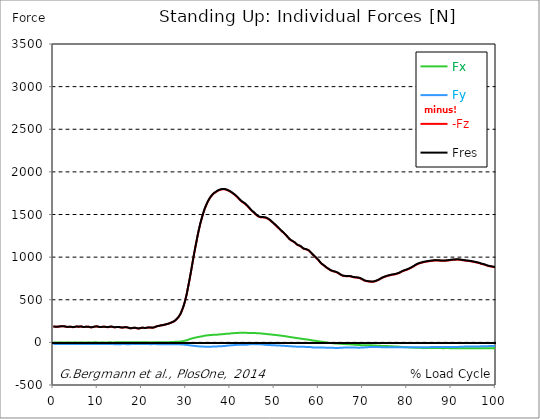
| Category |  Fx |  Fy |  -Fz |  Fres |
|---|---|---|---|---|
| 0.0 | -1.78 | -19.91 | 186.3 | 187.47 |
| 0.167348456675344 | -1.93 | -20.02 | 185.65 | 186.83 |
| 0.334696913350688 | -2.07 | -20.06 | 183.83 | 185.03 |
| 0.5020453700260321 | -1.86 | -19.89 | 182.56 | 183.75 |
| 0.669393826701376 | -1.54 | -19.67 | 182.43 | 183.59 |
| 0.83674228337672 | -1.32 | -19.46 | 183.34 | 184.47 |
| 1.0040907400520642 | -1.37 | -19.3 | 183.87 | 184.97 |
| 1.1621420602454444 | -1.34 | -19.09 | 183.55 | 184.62 |
| 1.3294905169207885 | -1.08 | -18.94 | 184.7 | 185.74 |
| 1.4968389735961325 | -0.89 | -18.94 | 186.75 | 187.76 |
| 1.6641874302714765 | -0.77 | -19.04 | 188.98 | 189.98 |
| 1.8315358869468206 | -0.92 | -19.1 | 189.7 | 190.71 |
| 1.9988843436221646 | -1.12 | -19.18 | 189.45 | 190.48 |
| 2.1662328002975086 | -1.13 | -19.22 | 188.72 | 189.75 |
| 2.333581256972853 | -1.19 | -19.28 | 188.54 | 189.59 |
| 2.5009297136481967 | -1.51 | -19.33 | 187.61 | 188.67 |
| 2.6682781703235405 | -2.02 | -19.36 | 185.43 | 186.52 |
| 2.8356266269988843 | -2.42 | -19.34 | 183.05 | 184.16 |
| 3.002975083674229 | -2.61 | -19.35 | 181.31 | 182.44 |
| 3.1703235403495724 | -2.52 | -19.3 | 180.35 | 181.5 |
| 3.337671997024917 | -2.44 | -19.27 | 180.32 | 181.47 |
| 3.4957233172182973 | -2.44 | -19.34 | 181.67 | 182.82 |
| 3.663071773893641 | -2.46 | -19.44 | 182.89 | 184.04 |
| 3.8304202305689854 | -2.65 | -19.51 | 182.95 | 184.1 |
| 3.997768687244329 | -2.84 | -19.51 | 181.86 | 183.02 |
| 4.165117143919673 | -3.04 | -19.49 | 180.1 | 181.26 |
| 4.332465600595017 | -2.98 | -19.36 | 178.59 | 179.75 |
| 4.499814057270361 | -2.7 | -19.14 | 178 | 179.13 |
| 4.667162513945706 | -2.14 | -18.91 | 179.07 | 180.14 |
| 4.834510970621049 | -1.52 | -18.8 | 181.09 | 182.12 |
| 5.001859427296393 | -1.25 | -18.95 | 183.31 | 184.34 |
| 5.169207883971737 | -1.15 | -19.07 | 184.97 | 186 |
| 5.336556340647081 | -1.26 | -19.14 | 185.38 | 186.42 |
| 5.503904797322425 | -1.35 | -19.21 | 184.56 | 185.62 |
| 5.671253253997769 | -1.37 | -19.28 | 183.21 | 184.29 |
| 5.82930457419115 | -1.03 | -19.22 | 183.03 | 184.1 |
| 5.996653030866494 | -0.63 | -19.12 | 184.75 | 185.8 |
| 6.164001487541838 | -0.43 | -19.07 | 186.35 | 187.39 |
| 6.331349944217181 | -0.72 | -19.1 | 185.88 | 186.92 |
| 6.498698400892526 | -1.12 | -19.15 | 183.53 | 184.6 |
| 6.66604685756787 | -1.23 | -19.1 | 180.68 | 181.77 |
| 6.833395314243213 | -0.96 | -18.96 | 179.42 | 180.51 |
| 7.000743770918558 | -0.55 | -18.8 | 179.7 | 180.76 |
| 7.168092227593902 | -0.16 | -18.79 | 181.77 | 182.81 |
| 7.335440684269246 | -0.13 | -18.91 | 183.58 | 184.63 |
| 7.50278914094459 | -0.2 | -18.95 | 184.39 | 185.44 |
| 7.6701375976199335 | -0.62 | -19.06 | 183.55 | 184.63 |
| 7.837486054295278 | -0.86 | -19.16 | 182.59 | 183.7 |
| 7.995537374488658 | -1.09 | -19.27 | 182.08 | 183.22 |
| 8.162885831164003 | -1.15 | -19.33 | 179.45 | 180.6 |
| 8.330234287839346 | -1.12 | -19.35 | 177.57 | 178.74 |
| 8.49758274451469 | -0.85 | -19.34 | 176.88 | 178.04 |
| 8.664931201190035 | -0.5 | -19.31 | 177.03 | 178.17 |
| 8.832279657865378 | -0.25 | -19.35 | 178.46 | 179.58 |
| 8.999628114540721 | 0 | -19.33 | 179.88 | 180.97 |
| 9.166976571216066 | 0.35 | -19.32 | 182.03 | 183.1 |
| 9.334325027891412 | 0.6 | -19.3 | 184.46 | 185.52 |
| 9.501673484566755 | 0.58 | -19.35 | 185.77 | 186.82 |
| 9.669021941242098 | 0.51 | -19.3 | 186.83 | 187.87 |
| 9.836370397917442 | 0.23 | -19.39 | 186.99 | 188.05 |
| 10.003718854592787 | -0.33 | -19.59 | 185.93 | 187.03 |
| 10.17106731126813 | -0.99 | -19.78 | 183.37 | 184.52 |
| 10.329118631461512 | -1.35 | -19.8 | 180.67 | 181.85 |
| 10.496467088136853 | -1.35 | -19.74 | 179.36 | 180.56 |
| 10.663815544812199 | -1.24 | -19.69 | 178.87 | 180.07 |
| 10.831164001487544 | -1.07 | -19.59 | 179.61 | 180.8 |
| 10.998512458162887 | -0.91 | -19.59 | 181.05 | 182.23 |
| 11.16586091483823 | -0.8 | -19.65 | 182.78 | 183.96 |
| 11.333209371513574 | -0.9 | -19.66 | 183.15 | 184.34 |
| 11.50055782818892 | -0.98 | -19.58 | 182.6 | 183.78 |
| 11.667906284864264 | -1.06 | -19.59 | 182.46 | 183.63 |
| 11.835254741539607 | -1.2 | -19.61 | 181.07 | 182.25 |
| 12.00260319821495 | -1.19 | -19.71 | 179.07 | 180.28 |
| 12.169951654890292 | -1 | -19.71 | 177.97 | 179.18 |
| 12.337300111565641 | -0.55 | -19.66 | 177.91 | 179.1 |
| 12.504648568240984 | -0.22 | -19.57 | 179.14 | 180.31 |
| 12.662699888434362 | 0.15 | -19.58 | 181.34 | 182.48 |
| 12.830048345109708 | 0.3 | -19.75 | 183.68 | 184.82 |
| 12.997396801785053 | 0.26 | -19.92 | 184.95 | 186.1 |
| 13.164745258460396 | 0.1 | -20.03 | 184.08 | 185.25 |
| 13.33209371513574 | -0.21 | -20.28 | 182.26 | 183.49 |
| 13.499442171811083 | -0.43 | -20.52 | 179.84 | 181.13 |
| 13.666790628486426 | -0.36 | -20.61 | 177.78 | 179.1 |
| 13.834139085161771 | -0.13 | -20.6 | 176.74 | 178.07 |
| 14.001487541837117 | 0.12 | -20.57 | 176.7 | 178.03 |
| 14.16883599851246 | 0.31 | -20.57 | 177.75 | 179.07 |
| 14.336184455187803 | 0.4 | -20.64 | 179.27 | 180.59 |
| 14.503532911863147 | 0.29 | -20.67 | 179.77 | 181.1 |
| 14.670881368538492 | 0.14 | -20.68 | 179.16 | 180.5 |
| 14.828932688731873 | 0.05 | -20.79 | 178.86 | 180.22 |
| 14.996281145407215 | -0.02 | -20.72 | 177.76 | 179.11 |
| 15.163629602082558 | -0.07 | -20.71 | 175.81 | 177.16 |
| 15.330978058757903 | 0.2 | -20.66 | 173.78 | 175.14 |
| 15.498326515433247 | 0.46 | -20.48 | 172.76 | 174.08 |
| 15.665674972108594 | 0.89 | -20.34 | 173.05 | 174.34 |
| 15.833023428783937 | 1.27 | -20.17 | 174.33 | 175.57 |
| 16.00037188545928 | 1.72 | -20.18 | 176.2 | 177.42 |
| 16.167720342134626 | 1.68 | -20.42 | 177.72 | 178.95 |
| 16.335068798809967 | 1.43 | -20.64 | 177.88 | 179.14 |
| 16.502417255485312 | 1.07 | -20.88 | 176.66 | 177.95 |
| 16.669765712160658 | 0.92 | -21.06 | 175.91 | 177.22 |
| 16.837114168836 | 0.58 | -21.12 | 173.44 | 174.79 |
| 17.004462625511344 | 0.23 | -21.1 | 170.28 | 171.66 |
| 17.16251394570472 | 0.15 | -20.95 | 167.28 | 168.68 |
| 17.32986240238007 | 0.36 | -20.71 | 165.29 | 166.67 |
| 17.497210859055414 | 0.89 | -20.33 | 164.33 | 165.67 |
| 17.664559315730756 | 1.45 | -19.97 | 165.22 | 166.5 |
| 17.8319077724061 | 2.04 | -19.68 | 167.18 | 168.41 |
| 17.999256229081443 | 2.57 | -19.52 | 169.25 | 170.45 |
| 18.166604685756788 | 2.59 | -19.58 | 170.68 | 171.87 |
| 18.333953142432133 | 2.44 | -19.63 | 171.06 | 172.26 |
| 18.501301599107478 | 2.15 | -19.69 | 170.53 | 171.73 |
| 18.668650055782823 | 1.7 | -19.76 | 168.72 | 169.95 |
| 18.835998512458165 | 1.35 | -19.72 | 166.29 | 167.53 |
| 19.00334696913351 | 1.08 | -19.6 | 163.81 | 165.05 |
| 19.170695425808855 | 1.19 | -19.41 | 162.45 | 163.68 |
| 19.338043882484197 | 1.58 | -19.14 | 162.53 | 163.72 |
| 19.496095202677576 | 1.96 | -18.97 | 164.39 | 165.56 |
| 19.66344365935292 | 2.31 | -18.88 | 166.82 | 167.96 |
| 19.830792116028263 | 2.38 | -19.07 | 169.58 | 170.73 |
| 19.998140572703612 | 2.24 | -19.2 | 171.02 | 172.18 |
| 20.165489029378953 | 1.86 | -19.37 | 171.62 | 172.79 |
| 20.3328374860543 | 1.43 | -19.52 | 170.67 | 171.87 |
| 20.500185942729644 | 1.12 | -19.53 | 169.16 | 170.36 |
| 20.667534399404985 | 0.81 | -19.54 | 167.64 | 168.86 |
| 20.83488285608033 | 0.89 | -19.53 | 168.12 | 169.33 |
| 21.002231312755672 | 0.97 | -19.63 | 169.76 | 170.97 |
| 21.16957976943102 | 1 | -19.86 | 171.81 | 173.03 |
| 21.336928226106362 | 0.91 | -20.14 | 173.65 | 174.89 |
| 21.504276682781704 | 0.65 | -20.38 | 174.49 | 175.76 |
| 21.67162513945705 | 0.27 | -20.51 | 174.22 | 175.52 |
| 21.82967645965043 | 0.03 | -20.63 | 173.97 | 175.28 |
| 21.997024916325774 | -0.19 | -20.73 | 173.43 | 174.75 |
| 22.16437337300112 | -0.37 | -20.71 | 172.08 | 173.42 |
| 22.33172182967646 | -0.43 | -20.65 | 171.24 | 172.57 |
| 22.499070286351806 | -0.03 | -20.44 | 172.15 | 173.44 |
| 22.666418743027148 | 0.38 | -20.28 | 173.49 | 174.75 |
| 22.833767199702496 | 0.73 | -20.21 | 175.6 | 176.84 |
| 23.00111565637784 | 1.05 | -20.23 | 179.05 | 180.26 |
| 23.168464113053183 | 1.24 | -20.44 | 183.57 | 184.78 |
| 23.335812569728528 | 1.14 | -20.64 | 187.34 | 188.56 |
| 23.50316102640387 | 1.09 | -20.74 | 190 | 191.21 |
| 23.670509483079215 | 0.85 | -20.8 | 191.27 | 192.49 |
| 23.83785793975456 | 0.52 | -20.86 | 192.06 | 193.3 |
| 23.995909259947936 | 0.56 | -20.94 | 194.32 | 195.55 |
| 24.163257716623285 | 0.55 | -21.14 | 197.41 | 198.66 |
| 24.330606173298627 | 0.71 | -21.11 | 199.06 | 200.3 |
| 24.49795462997397 | 0.9 | -21.04 | 199.79 | 201.02 |
| 24.665303086649313 | 1.09 | -20.97 | 200.54 | 201.76 |
| 24.83265154332466 | 1.31 | -21.02 | 202.75 | 203.98 |
| 25.0 | 1.59 | -21.01 | 205.26 | 206.47 |
| 25.167348456675345 | 1.8 | -20.95 | 207.34 | 208.54 |
| 25.334696913350694 | 1.93 | -20.91 | 208.83 | 210.02 |
| 25.502045370026035 | 1.91 | -21.04 | 212.11 | 213.3 |
| 25.669393826701377 | 1.92 | -20.94 | 213.72 | 214.89 |
| 25.836742283376722 | 2.02 | -20.87 | 215.91 | 217.07 |
| 26.004090740052067 | 2.21 | -20.85 | 218.62 | 219.78 |
| 26.17143919672741 | 2.39 | -20.84 | 221.35 | 222.51 |
| 26.329490516920792 | 2.72 | -20.83 | 224.39 | 225.55 |
| 26.49683897359613 | 3.15 | -20.8 | 227.95 | 229.12 |
| 26.66418743027148 | 3.63 | -20.79 | 232.26 | 233.43 |
| 26.831535886946828 | 4.13 | -20.77 | 235.98 | 237.15 |
| 26.998884343622166 | 4.61 | -20.76 | 239.65 | 240.83 |
| 27.166232800297514 | 5.1 | -20.83 | 243.88 | 245.07 |
| 27.333581256972852 | 5.58 | -20.95 | 248.38 | 249.58 |
| 27.5009297136482 | 6.06 | -21.08 | 253.07 | 254.28 |
| 27.668278170323543 | 6.42 | -21.3 | 261.96 | 263.18 |
| 27.835626626998888 | 6.47 | -21.53 | 270.77 | 272 |
| 28.002975083674233 | 6.84 | -21.71 | 279.66 | 280.9 |
| 28.170323540349575 | 7.39 | -21.9 | 289.8 | 291.03 |
| 28.33767199702492 | 7.94 | -22.24 | 299.15 | 300.4 |
| 28.50502045370026 | 8.7 | -22.76 | 312.3 | 313.58 |
| 28.663071773893645 | 9.83 | -23.01 | 327.17 | 328.48 |
| 28.830420230568986 | 10.75 | -23.68 | 344.26 | 345.61 |
| 28.99776868724433 | 11.89 | -24.36 | 364.32 | 365.7 |
| 29.165117143919673 | 13.22 | -24.98 | 386.79 | 388.22 |
| 29.33246560059502 | 15.14 | -25.31 | 409.87 | 411.36 |
| 29.499814057270367 | 16.73 | -26.28 | 435.21 | 436.77 |
| 29.66716251394571 | 18.68 | -27.1 | 464.3 | 465.94 |
| 29.834510970621054 | 20.92 | -27.87 | 496.35 | 498.06 |
| 30.00185942729639 | 23.19 | -28.86 | 532.08 | 533.86 |
| 30.169207883971744 | 25.77 | -29.67 | 569.34 | 571.21 |
| 30.33655634064708 | 28.59 | -31.12 | 613.86 | 615.84 |
| 30.50390479732243 | 32.03 | -32.04 | 658.17 | 660.31 |
| 30.671253253997772 | 34.93 | -33.18 | 702.44 | 704.74 |
| 30.829304574191156 | 37.96 | -34.48 | 747.36 | 749.81 |
| 30.996653030866494 | 40.38 | -36.12 | 794.88 | 797.46 |
| 31.164001487541842 | 43.66 | -37.04 | 843.19 | 845.91 |
| 31.331349944217187 | 46.37 | -38.16 | 892.77 | 895.59 |
| 31.498698400892525 | 48.72 | -39.3 | 943.93 | 946.82 |
| 31.666046857567874 | 50.75 | -40.22 | 993.01 | 995.94 |
| 31.833395314243212 | 52.68 | -41.07 | 1041.27 | 1044.24 |
| 32.00074377091856 | 54.22 | -42.06 | 1087.52 | 1090.53 |
| 32.1680922275939 | 56.35 | -43.11 | 1133.42 | 1136.49 |
| 32.33544068426925 | 58.62 | -43.93 | 1174.51 | 1177.66 |
| 32.50278914094459 | 60.38 | -44.74 | 1219.73 | 1222.91 |
| 32.670137597619934 | 62.01 | -45.65 | 1263.78 | 1266.98 |
| 32.83748605429528 | 63.52 | -46.48 | 1303.95 | 1307.2 |
| 33.004834510970625 | 65.34 | -47.03 | 1341.92 | 1345.22 |
| 33.162885831164004 | 67.2 | -47.58 | 1379.39 | 1382.73 |
| 33.33023428783935 | 68.61 | -47.78 | 1413.44 | 1416.78 |
| 33.497582744514695 | 69.96 | -47.94 | 1444.09 | 1447.45 |
| 33.664931201190036 | 71.74 | -47.92 | 1474.99 | 1478.39 |
| 33.83227965786538 | 73.65 | -48.23 | 1504.62 | 1508.09 |
| 33.99962811454073 | 75.68 | -49.1 | 1532.34 | 1535.91 |
| 34.16697657121607 | 77.66 | -50.2 | 1558.13 | 1561.81 |
| 34.33432502789141 | 79.21 | -50.79 | 1580.5 | 1584.25 |
| 34.50167348456676 | 80.43 | -51.33 | 1601.59 | 1605.39 |
| 34.6690219412421 | 81.37 | -51.59 | 1621.35 | 1625.17 |
| 34.83637039791744 | 82.32 | -51.67 | 1639.65 | 1643.49 |
| 35.00371885459279 | 83.45 | -51.71 | 1656.83 | 1660.69 |
| 35.17106731126814 | 84.25 | -51.53 | 1672.48 | 1676.35 |
| 35.338415767943474 | 85.04 | -51.26 | 1687.02 | 1690.9 |
| 35.49646708813686 | 85.72 | -50.84 | 1700.28 | 1704.17 |
| 35.6638155448122 | 86.36 | -50.37 | 1712.52 | 1716.4 |
| 35.831164001487544 | 87.01 | -49.87 | 1723.33 | 1727.21 |
| 35.998512458162885 | 87.9 | -49.56 | 1732.82 | 1736.72 |
| 36.165860914838234 | 88.93 | -49.26 | 1741.46 | 1745.39 |
| 36.333209371513576 | 89.82 | -48.82 | 1749.2 | 1753.14 |
| 36.50055782818892 | 90.62 | -48.35 | 1755.64 | 1759.61 |
| 36.667906284864266 | 90.34 | -47.72 | 1760.03 | 1763.95 |
| 36.83525474153961 | 90.08 | -47.41 | 1765.37 | 1769.24 |
| 37.002603198214956 | 90.32 | -47.3 | 1772.21 | 1776.06 |
| 37.1699516548903 | 91 | -46.86 | 1777.7 | 1781.56 |
| 37.337300111565646 | 91.81 | -46.45 | 1782.14 | 1786.02 |
| 37.50464856824098 | 92.74 | -46.01 | 1785.66 | 1789.55 |
| 37.66269988843437 | 94.01 | -45.81 | 1788.97 | 1792.91 |
| 37.83004834510971 | 94.94 | -45.4 | 1791.45 | 1795.41 |
| 37.99739680178505 | 95.25 | -44.69 | 1793.38 | 1797.33 |
| 38.16474525846039 | 95.46 | -44.12 | 1794.8 | 1798.73 |
| 38.33209371513574 | 96.1 | -43.77 | 1795.67 | 1799.6 |
| 38.49944217181109 | 97.72 | -43.28 | 1796.01 | 1799.99 |
| 38.666790628486424 | 98.83 | -42.72 | 1795.29 | 1799.31 |
| 38.83413908516178 | 99.76 | -41.82 | 1793.78 | 1797.82 |
| 39.001487541837115 | 100.46 | -40.79 | 1791.56 | 1795.61 |
| 39.16883599851246 | 100.84 | -39.64 | 1788.64 | 1792.68 |
| 39.336184455187805 | 101.15 | -38.65 | 1785.54 | 1789.58 |
| 39.503532911863154 | 101.39 | -37.09 | 1781.64 | 1785.66 |
| 39.670881368538495 | 102.34 | -36.2 | 1777.27 | 1781.31 |
| 39.83822982521384 | 103.49 | -35.89 | 1772.88 | 1776.97 |
| 39.996281145407224 | 104.47 | -35.21 | 1767.98 | 1772.11 |
| 40.163629602082565 | 105.47 | -34.22 | 1762.14 | 1766.31 |
| 40.33097805875791 | 106.34 | -33.54 | 1756.31 | 1760.52 |
| 40.498326515433256 | 107.16 | -32.94 | 1750.53 | 1754.77 |
| 40.6656749721086 | 107.71 | -32.46 | 1744.17 | 1748.43 |
| 40.83302342878393 | 108.15 | -32.03 | 1737.56 | 1741.85 |
| 41.00037188545929 | 108.59 | -31.53 | 1730.83 | 1735.14 |
| 41.16772034213463 | 109.06 | -30.7 | 1723.39 | 1727.73 |
| 41.33506879880997 | 109.54 | -29.89 | 1715.42 | 1719.8 |
| 41.50241725548531 | 109.97 | -29.37 | 1707.28 | 1711.71 |
| 41.66976571216066 | 110.48 | -28.87 | 1699.1 | 1703.57 |
| 41.837114168836 | 110.99 | -28.25 | 1690.61 | 1695.12 |
| 42.004462625511344 | 112.03 | -27.49 | 1680.7 | 1685.27 |
| 42.17181108218669 | 112.61 | -27.07 | 1671.55 | 1676.17 |
| 42.32986240238007 | 113.01 | -26.99 | 1662.61 | 1667.27 |
| 42.497210859055414 | 113.35 | -26.91 | 1654.27 | 1658.95 |
| 42.66455931573076 | 113.83 | -27.1 | 1648.42 | 1653.14 |
| 42.831907772406105 | 114.38 | -27.39 | 1642.19 | 1646.96 |
| 42.999256229081446 | 114.21 | -27.62 | 1636.97 | 1641.73 |
| 43.16660468575679 | 113.19 | -27.66 | 1631.64 | 1636.31 |
| 43.33395314243214 | 112.34 | -27.75 | 1625.74 | 1630.35 |
| 43.50130159910748 | 112.21 | -28.02 | 1617.39 | 1622.01 |
| 43.66865005578282 | 111.66 | -27.67 | 1608.89 | 1613.48 |
| 43.83599851245817 | 111.18 | -26.75 | 1600.33 | 1604.89 |
| 44.00334696913351 | 110.89 | -25.58 | 1591.92 | 1596.45 |
| 44.17069542580886 | 110.98 | -24.24 | 1582.46 | 1586.99 |
| 44.3380438824842 | 111.28 | -22.89 | 1572.67 | 1577.21 |
| 44.49609520267758 | 111.33 | -21.8 | 1562.83 | 1567.37 |
| 44.66344365935292 | 110.98 | -21.11 | 1552.91 | 1557.44 |
| 44.83079211602827 | 110.91 | -20.59 | 1544.22 | 1548.76 |
| 44.99814057270361 | 110.9 | -20.24 | 1536.02 | 1540.58 |
| 45.16548902937895 | 110.47 | -20.72 | 1529.53 | 1534.08 |
| 45.332837486054295 | 109.8 | -21.27 | 1523.4 | 1527.92 |
| 45.500185942729644 | 109.14 | -21.62 | 1514.23 | 1518.73 |
| 45.66753439940499 | 108.79 | -21.03 | 1505.74 | 1510.22 |
| 45.83488285608033 | 108.42 | -20.76 | 1497.67 | 1502.15 |
| 46.00223131275568 | 108 | -20.69 | 1489.85 | 1494.32 |
| 46.16957976943102 | 107.47 | -21.07 | 1482.6 | 1487.06 |
| 46.336928226106366 | 106.9 | -21.56 | 1476.78 | 1481.22 |
| 46.50427668278171 | 106.26 | -22 | 1472.85 | 1477.26 |
| 46.671625139457056 | 105.63 | -22.37 | 1469.26 | 1473.65 |
| 46.829676459650436 | 105 | -22.8 | 1466.18 | 1470.53 |
| 46.99702491632577 | 104.37 | -23.64 | 1466.14 | 1470.46 |
| 47.16437337300112 | 103.66 | -24.45 | 1466.32 | 1470.61 |
| 47.33172182967646 | 102.87 | -25.24 | 1466.74 | 1470.98 |
| 47.49907028635181 | 101.95 | -25.98 | 1465.72 | 1469.92 |
| 47.66641874302716 | 100.94 | -26.75 | 1464.6 | 1468.76 |
| 47.83376719970249 | 99.93 | -27.59 | 1464.27 | 1468.38 |
| 48.001115656377834 | 98.9 | -28.3 | 1461.82 | 1465.89 |
| 48.16846411305319 | 97.86 | -28.94 | 1458.2 | 1462.23 |
| 48.33581256972853 | 96.82 | -29.58 | 1454.58 | 1458.57 |
| 48.50316102640387 | 95.93 | -30.02 | 1449.66 | 1453.63 |
| 48.67050948307921 | 95.09 | -30.42 | 1444.43 | 1448.38 |
| 48.837857939754564 | 94.32 | -31 | 1438.69 | 1442.63 |
| 49.005206396429905 | 93.6 | -31.69 | 1432.7 | 1436.63 |
| 49.163257716623285 | 92.59 | -32.37 | 1425.12 | 1429.05 |
| 49.33060617329863 | 91.57 | -32.58 | 1416.4 | 1420.28 |
| 49.49795462997397 | 90.7 | -32.77 | 1408.85 | 1412.69 |
| 49.66530308664932 | 89.77 | -33.25 | 1401.59 | 1405.41 |
| 49.832651543324666 | 88.69 | -34 | 1394.25 | 1398.04 |
| 50.0 | 87.87 | -34.44 | 1386.02 | 1389.78 |
| 50.16734845667534 | 87.02 | -34.92 | 1377.94 | 1381.68 |
| 50.33469691335069 | 86.09 | -35.46 | 1369.98 | 1373.71 |
| 50.50204537002604 | 85.02 | -35.92 | 1361.24 | 1364.92 |
| 50.66939382670139 | 84.02 | -36.26 | 1352.56 | 1356.19 |
| 50.836742283376715 | 82.96 | -36.85 | 1344.28 | 1347.89 |
| 51.00409074005207 | 82.07 | -37.03 | 1336.11 | 1339.7 |
| 51.17143919672741 | 81.08 | -37.44 | 1328.86 | 1332.42 |
| 51.32949051692079 | 79.98 | -37.9 | 1319.67 | 1323.19 |
| 51.496838973596134 | 78.69 | -38.49 | 1310.89 | 1314.35 |
| 51.66418743027148 | 77.47 | -38.96 | 1302.67 | 1306.08 |
| 51.831535886946824 | 76.21 | -39.58 | 1294.97 | 1298.34 |
| 51.99888434362217 | 75.43 | -39.8 | 1287.31 | 1290.66 |
| 52.16623280029752 | 74.32 | -40.45 | 1279.05 | 1282.36 |
| 52.33358125697285 | 72.96 | -41.3 | 1270.52 | 1273.8 |
| 52.5009297136482 | 71.72 | -41.45 | 1262.26 | 1265.49 |
| 52.668278170323546 | 70.23 | -41.86 | 1252.24 | 1255.41 |
| 52.835626626998895 | 68.72 | -42.64 | 1242.83 | 1245.96 |
| 53.00297508367424 | 67.18 | -43.33 | 1233.68 | 1236.75 |
| 53.17032354034958 | 65.66 | -43.92 | 1224.22 | 1227.23 |
| 53.33767199702492 | 63.94 | -44.67 | 1213.87 | 1216.8 |
| 53.50502045370027 | 62.63 | -45.32 | 1206.12 | 1209.02 |
| 53.663071773893655 | 61.38 | -45.96 | 1199.01 | 1201.89 |
| 53.83042023056899 | 60.07 | -46.6 | 1194.46 | 1197.32 |
| 53.99776868724433 | 58.89 | -47.15 | 1189.28 | 1192.13 |
| 54.16511714391967 | 57.67 | -47.93 | 1183.47 | 1186.34 |
| 54.33246560059503 | 56.37 | -48.24 | 1178.76 | 1181.6 |
| 54.49981405727037 | 55.08 | -48.36 | 1173.71 | 1176.51 |
| 54.667162513945705 | 53.8 | -48.54 | 1167.93 | 1170.7 |
| 54.834510970621054 | 52.38 | -49 | 1159.28 | 1162 |
| 55.0018594272964 | 50.81 | -50.26 | 1150.06 | 1152.74 |
| 55.169207883971744 | 49.51 | -51.33 | 1143.42 | 1146.12 |
| 55.336556340647086 | 48.48 | -52.21 | 1139.14 | 1141.86 |
| 55.50390479732243 | 47.11 | -52.23 | 1136.37 | 1139.05 |
| 55.671253253997776 | 45.98 | -51.85 | 1133.25 | 1135.88 |
| 55.83860171067312 | 45.04 | -51.19 | 1129.85 | 1132.43 |
| 55.9966530308665 | 43.68 | -50.43 | 1123.45 | 1125.96 |
| 56.16400148754184 | 42.18 | -50.15 | 1115.34 | 1117.8 |
| 56.33134994421718 | 40.64 | -49.91 | 1107.92 | 1110.32 |
| 56.498698400892536 | 39.36 | -50.32 | 1101.16 | 1103.57 |
| 56.66604685756788 | 38.12 | -51.27 | 1096.23 | 1098.67 |
| 56.83339531424321 | 37.03 | -52.77 | 1093.94 | 1096.43 |
| 57.00074377091856 | 36.23 | -53.64 | 1092.86 | 1095.39 |
| 57.16809222759391 | 35.38 | -53.79 | 1090.85 | 1093.37 |
| 57.33544068426925 | 34.44 | -53.42 | 1087.79 | 1090.28 |
| 57.5027891409446 | 33.25 | -53.42 | 1084.15 | 1086.63 |
| 57.670137597619934 | 32 | -53.52 | 1080.08 | 1082.58 |
| 57.83748605429528 | 30.63 | -54.08 | 1072.64 | 1075.14 |
| 58.004834510970625 | 29.26 | -54.97 | 1065.39 | 1067.93 |
| 58.16288583116401 | 27.76 | -55.79 | 1057.17 | 1059.73 |
| 58.330234287839346 | 26.05 | -56.58 | 1047.26 | 1049.82 |
| 58.497582744514695 | 24.2 | -57.75 | 1037.34 | 1039.91 |
| 58.66493120119004 | 22.48 | -59.07 | 1028.19 | 1030.76 |
| 58.832279657865385 | 21.47 | -59.91 | 1020.8 | 1023.39 |
| 58.999628114540734 | 20.33 | -59.91 | 1013.06 | 1015.65 |
| 59.16697657121607 | 19.18 | -59.91 | 1005.33 | 1007.91 |
| 59.33432502789142 | 18.16 | -59.61 | 996.72 | 999.26 |
| 59.50167348456676 | 16.74 | -59.59 | 987.47 | 989.96 |
| 59.66902194124211 | 15.1 | -60.16 | 978.16 | 980.66 |
| 59.83637039791745 | 13.88 | -60.77 | 970.07 | 972.61 |
| 60.00371885459278 | 12.66 | -60.93 | 960.15 | 962.69 |
| 60.17106731126813 | 11.75 | -60.81 | 950.13 | 952.66 |
| 60.33841576794349 | 10.18 | -60.76 | 939.02 | 941.54 |
| 60.49646708813685 | 8.89 | -60.37 | 929.21 | 931.71 |
| 60.6638155448122 | 7.76 | -59.97 | 920.43 | 922.92 |
| 60.831164001487544 | 6.87 | -59.61 | 914.15 | 916.62 |
| 60.99851245816289 | 5.43 | -60.12 | 908.37 | 910.84 |
| 61.16586091483824 | 3.89 | -60.81 | 902.69 | 905.17 |
| 61.333209371513576 | 2.18 | -61.51 | 895.77 | 898.26 |
| 61.50055782818892 | 1 | -61.87 | 887.72 | 890.23 |
| 61.667906284864266 | -0.39 | -61.92 | 879.98 | 882.49 |
| 61.835254741539615 | -1.41 | -61.9 | 873.81 | 876.32 |
| 62.002603198214956 | -2.31 | -62 | 868.41 | 870.94 |
| 62.16995165489029 | -3.66 | -62.26 | 862.99 | 865.53 |
| 62.33730011156564 | -4.81 | -62.55 | 857.89 | 860.46 |
| 62.504648568240995 | -5.67 | -62.67 | 851.58 | 854.2 |
| 62.67199702491633 | -6.73 | -62.56 | 845.5 | 848.12 |
| 62.83004834510971 | -7.79 | -62.58 | 841.61 | 844.25 |
| 62.99739680178505 | -8.81 | -63.06 | 838.54 | 841.22 |
| 63.1647452584604 | -9.81 | -63.63 | 835.44 | 838.16 |
| 63.33209371513575 | -10.79 | -64.17 | 832.98 | 835.76 |
| 63.4994421718111 | -11.76 | -64.71 | 830.66 | 833.49 |
| 63.666790628486424 | -12.61 | -65.22 | 828.59 | 831.47 |
| 63.83413908516177 | -13.2 | -65.64 | 826.52 | 829.45 |
| 64.00148754183712 | -13.75 | -65.9 | 822.89 | 825.85 |
| 64.16883599851248 | -14.24 | -65.71 | 818.44 | 821.41 |
| 64.3361844551878 | -14.57 | -65.25 | 814.53 | 817.49 |
| 64.50353291186315 | -14.86 | -64.81 | 809.45 | 812.4 |
| 64.6708813685385 | -15.19 | -64.4 | 803.53 | 806.46 |
| 64.83822982521384 | -15.92 | -64.05 | 797.85 | 800.77 |
| 65.00557828188919 | -16.57 | -63.53 | 791.86 | 794.76 |
| 65.16362960208257 | -17.01 | -62.78 | 786.99 | 789.85 |
| 65.3309780587579 | -17.69 | -62.29 | 783.39 | 786.23 |
| 65.49832651543326 | -18.39 | -61.72 | 780.82 | 783.63 |
| 65.6656749721086 | -18.92 | -61.34 | 778.93 | 781.73 |
| 65.83302342878395 | -19.35 | -61.09 | 777.64 | 780.43 |
| 66.00037188545929 | -19.85 | -60.89 | 777.1 | 779.88 |
| 66.16772034213463 | -20.56 | -60.65 | 777.1 | 779.88 |
| 66.33506879880998 | -21.2 | -60.7 | 776.44 | 779.23 |
| 66.50241725548531 | -21.61 | -60.62 | 776.08 | 778.87 |
| 66.66976571216065 | -22.08 | -60.48 | 776.15 | 778.94 |
| 66.83711416883601 | -22.51 | -60.37 | 776.08 | 778.87 |
| 67.00446262551135 | -22.9 | -60.34 | 775.67 | 778.47 |
| 67.1718110821867 | -23.39 | -60.42 | 774.35 | 777.17 |
| 67.32986240238007 | -23.97 | -60.53 | 772.66 | 775.52 |
| 67.49721085905541 | -24.78 | -60.64 | 769.54 | 772.44 |
| 67.66455931573076 | -25.24 | -60.82 | 766.4 | 769.34 |
| 67.83190777240611 | -25.91 | -60.71 | 764.42 | 767.38 |
| 67.99925622908145 | -26.7 | -60.51 | 763.12 | 766.1 |
| 68.16660468575678 | -27.57 | -60.69 | 762.04 | 765.07 |
| 68.33395314243214 | -28.36 | -60.91 | 760.95 | 764.03 |
| 68.50130159910749 | -28.64 | -61.33 | 759.85 | 762.98 |
| 68.66865005578282 | -29.06 | -61.62 | 759.17 | 762.35 |
| 68.83599851245816 | -29.66 | -61.75 | 758.67 | 761.89 |
| 69.00334696913352 | -30.59 | -61.73 | 757.15 | 760.42 |
| 69.17069542580886 | -30.87 | -61.67 | 754.58 | 757.87 |
| 69.3380438824842 | -31.66 | -61.75 | 751.21 | 754.56 |
| 69.50539233915956 | -32.27 | -61.18 | 748 | 751.35 |
| 69.66344365935292 | -33.14 | -60.83 | 744.64 | 748.01 |
| 69.83079211602826 | -33.57 | -60.43 | 739.62 | 743 |
| 69.99814057270362 | -33.78 | -59.97 | 734.62 | 738 |
| 70.16548902937896 | -33.92 | -59.56 | 728.99 | 732.37 |
| 70.33283748605429 | -33.91 | -59.09 | 724.73 | 728.1 |
| 70.50018594272964 | -33.98 | -58.64 | 721.68 | 725.02 |
| 70.667534399405 | -34.12 | -58.12 | 719.4 | 722.72 |
| 70.83488285608033 | -33.85 | -57.38 | 717.34 | 720.58 |
| 71.00223131275568 | -33.74 | -56.64 | 716.11 | 719.29 |
| 71.16957976943102 | -33.9 | -55.82 | 715.4 | 718.51 |
| 71.33692822610637 | -34.08 | -55.15 | 714.21 | 717.28 |
| 71.50427668278171 | -34.16 | -54.71 | 712.75 | 715.79 |
| 71.67162513945706 | -34.24 | -54.33 | 712.23 | 715.24 |
| 71.8389735961324 | -34.44 | -53.87 | 711.85 | 714.83 |
| 71.99702491632577 | -34.8 | -53.55 | 711.27 | 714.24 |
| 72.16437337300113 | -35.18 | -53.3 | 710.77 | 713.74 |
| 72.33172182967647 | -35.51 | -53.01 | 711.75 | 714.71 |
| 72.49907028635181 | -36.17 | -53.08 | 713.54 | 716.53 |
| 72.66641874302715 | -36.76 | -53.08 | 715.39 | 718.4 |
| 72.8337671997025 | -37.14 | -52.87 | 717.48 | 720.49 |
| 73.00111565637783 | -37.87 | -53.2 | 721.06 | 724.11 |
| 73.16846411305319 | -38.52 | -53.48 | 724.46 | 727.54 |
| 73.33581256972853 | -39.12 | -53.7 | 727.7 | 730.83 |
| 73.50316102640387 | -39.4 | -54.07 | 731.98 | 735.13 |
| 73.67050948307921 | -39.78 | -54.54 | 736.74 | 739.93 |
| 73.83785793975457 | -40.57 | -55.29 | 742.64 | 745.9 |
| 74.00520639642991 | -40.74 | -55.69 | 746.95 | 750.23 |
| 74.16325771662328 | -41.35 | -56.21 | 752.19 | 755.52 |
| 74.33060617329863 | -42.1 | -56.64 | 756.46 | 759.85 |
| 74.49795462997398 | -42.6 | -56.91 | 760.16 | 763.58 |
| 74.66530308664932 | -42.83 | -57.41 | 763.22 | 766.68 |
| 74.83265154332466 | -43.36 | -57.8 | 766.57 | 770.07 |
| 75.00000000000001 | -43.59 | -57.94 | 770.32 | 773.84 |
| 75.16734845667534 | -43.76 | -58.46 | 773.06 | 776.62 |
| 75.3346969133507 | -43.87 | -58.12 | 776.21 | 779.75 |
| 75.50204537002605 | -43.8 | -57.52 | 778.93 | 782.42 |
| 75.66939382670138 | -43.84 | -57.13 | 781.4 | 784.87 |
| 75.83674228337672 | -44.06 | -57.04 | 783.68 | 787.15 |
| 76.00409074005208 | -44.45 | -57.15 | 785.39 | 788.89 |
| 76.17143919672742 | -44.98 | -57.25 | 787.73 | 791.25 |
| 76.33878765340276 | -45.58 | -57.13 | 790.19 | 793.72 |
| 76.49683897359614 | -46.07 | -56.9 | 791.83 | 795.36 |
| 76.66418743027148 | -46.69 | -56.45 | 793.63 | 797.17 |
| 76.83153588694682 | -47.09 | -56.31 | 794.84 | 798.39 |
| 76.99888434362218 | -47.46 | -56.22 | 795.97 | 799.54 |
| 77.16623280029752 | -47.81 | -56.16 | 797.26 | 800.85 |
| 77.33358125697285 | -48.12 | -56.19 | 799.05 | 802.66 |
| 77.5009297136482 | -48.56 | -56.13 | 801.44 | 805.08 |
| 77.66827817032356 | -49.06 | -56.03 | 804.4 | 808.05 |
| 77.83562662699889 | -49.62 | -56.13 | 807.12 | 810.79 |
| 78.00297508367423 | -50.15 | -56.19 | 810.04 | 813.75 |
| 78.17032354034959 | -50.62 | -56.49 | 812.63 | 816.37 |
| 78.33767199702493 | -51.16 | -56.49 | 816.73 | 820.49 |
| 78.50502045370027 | -51.72 | -56.52 | 821.33 | 825.1 |
| 78.67236891037561 | -52.79 | -56.66 | 827.04 | 830.86 |
| 78.83042023056899 | -53.82 | -56.67 | 831.98 | 835.85 |
| 78.99776868724433 | -54.83 | -56.66 | 835.47 | 839.38 |
| 79.16511714391969 | -55.84 | -56.84 | 838.88 | 842.85 |
| 79.33246560059503 | -56.17 | -56.94 | 841.68 | 845.66 |
| 79.49981405727036 | -56.66 | -56.94 | 844.72 | 848.72 |
| 79.66716251394571 | -57.17 | -57.06 | 847.64 | 851.67 |
| 79.83451097062107 | -57.39 | -57.32 | 850.42 | 854.47 |
| 80.00185942729641 | -57.8 | -57.5 | 853.75 | 857.83 |
| 80.16920788397174 | -58.26 | -57.68 | 857.2 | 861.3 |
| 80.33655634064709 | -58.71 | -57.73 | 860.9 | 865.02 |
| 80.50390479732243 | -59.27 | -57.91 | 864.85 | 868.99 |
| 80.67125325399778 | -59.88 | -58.18 | 869.31 | 873.49 |
| 80.83860171067312 | -60.21 | -58.46 | 873.47 | 877.67 |
| 80.99665303086651 | -60.67 | -58.46 | 878.07 | 882.28 |
| 81.16400148754184 | -61.25 | -58.59 | 882.85 | 887.09 |
| 81.3313499442172 | -61.57 | -58.51 | 888.23 | 892.47 |
| 81.49869840089255 | -61.88 | -58.14 | 893.4 | 897.62 |
| 81.66604685756786 | -62.24 | -57.81 | 898.72 | 902.91 |
| 81.83339531424322 | -62.57 | -58.17 | 904.38 | 908.6 |
| 82.00074377091858 | -62.9 | -58.28 | 909.64 | 913.87 |
| 82.16809222759392 | -63.15 | -57.99 | 914.41 | 918.62 |
| 82.33544068426926 | -63.43 | -57.79 | 918.45 | 922.66 |
| 82.50278914094459 | -63.55 | -57.77 | 922 | 926.21 |
| 82.67013759761994 | -63.64 | -57.76 | 925.48 | 929.68 |
| 82.83748605429528 | -63.85 | -57.5 | 928.35 | 932.54 |
| 83.00483451097062 | -64.1 | -57.33 | 930.58 | 934.77 |
| 83.17218296764597 | -64.56 | -57.45 | 932.99 | 937.21 |
| 83.33023428783935 | -65.08 | -57.62 | 935.03 | 939.3 |
| 83.4975827445147 | -65.33 | -57.06 | 937.91 | 942.15 |
| 83.66493120119004 | -65.17 | -56.9 | 940.33 | 944.55 |
| 83.83227965786537 | -65.48 | -56.96 | 941.94 | 946.17 |
| 83.99962811454073 | -65.79 | -56.93 | 943.59 | 947.84 |
| 84.16697657121607 | -65.78 | -57.03 | 944.99 | 949.24 |
| 84.33432502789142 | -65.89 | -56.83 | 946.55 | 950.79 |
| 84.50167348456677 | -66.26 | -56.8 | 948.29 | 952.54 |
| 84.6690219412421 | -66.55 | -56.77 | 949.66 | 953.92 |
| 84.83637039791745 | -66.58 | -56.61 | 950.88 | 955.15 |
| 85.0037188545928 | -66.53 | -56.17 | 952.51 | 956.75 |
| 85.17106731126813 | -66.35 | -55.6 | 953.98 | 958.18 |
| 85.33841576794349 | -66.34 | -55.25 | 954.58 | 958.76 |
| 85.50576422461883 | -66.53 | -55.08 | 955.25 | 959.44 |
| 85.66381554481221 | -66.82 | -54.92 | 956.52 | 960.72 |
| 85.83116400148755 | -67.18 | -54.32 | 957.92 | 962.11 |
| 85.99851245816289 | -67.12 | -53.98 | 959.09 | 963.26 |
| 86.16586091483823 | -67.04 | -53.66 | 960.25 | 964.4 |
| 86.33320937151358 | -67.07 | -53.59 | 960.66 | 964.82 |
| 86.50055782818893 | -67.04 | -53.58 | 960.88 | 965.04 |
| 86.66790628486427 | -66.78 | -53.58 | 960.55 | 964.69 |
| 86.83525474153961 | -66.93 | -53.52 | 959.93 | 964.07 |
| 87.00260319821496 | -67.11 | -53.55 | 959.47 | 963.62 |
| 87.16995165489031 | -67.19 | -53.63 | 959.08 | 963.23 |
| 87.33730011156564 | -67.27 | -53.59 | 958.58 | 962.74 |
| 87.504648568241 | -67.46 | -53.23 | 957.93 | 962.08 |
| 87.67199702491634 | -67.34 | -53.16 | 957.24 | 961.37 |
| 87.83004834510972 | -67.36 | -53.1 | 956.87 | 961 |
| 87.99739680178506 | -67.5 | -53.04 | 956.8 | 960.93 |
| 88.1647452584604 | -67.54 | -53.12 | 956.81 | 960.95 |
| 88.33209371513574 | -67.52 | -53.17 | 956.73 | 960.87 |
| 88.49944217181108 | -67.36 | -53.14 | 956.52 | 960.63 |
| 88.66679062848644 | -67.43 | -53.06 | 957.16 | 961.27 |
| 88.83413908516178 | -67.42 | -53.11 | 958.08 | 962.18 |
| 89.00148754183712 | -67.41 | -53.07 | 959.16 | 963.25 |
| 89.16883599851246 | -67.36 | -53.06 | 960.25 | 964.32 |
| 89.33618445518782 | -67.31 | -53.1 | 961.08 | 965.15 |
| 89.50353291186315 | -67.51 | -53.26 | 962.11 | 966.2 |
| 89.6708813685385 | -67.83 | -53.36 | 963.18 | 967.3 |
| 89.83822982521386 | -68.06 | -53.22 | 964.94 | 969.06 |
| 90.00557828188919 | -68.14 | -53.34 | 966.2 | 970.32 |
| 90.16362960208257 | -68.37 | -53.33 | 967.16 | 971.29 |
| 90.3309780587579 | -68.33 | -53.3 | 967.76 | 971.88 |
| 90.49832651543326 | -68.13 | -53.31 | 968.06 | 972.17 |
| 90.66567497210859 | -68.22 | -53.22 | 968.31 | 972.42 |
| 90.83302342878395 | -68.55 | -53.14 | 969.28 | 973.41 |
| 91.00037188545929 | -68.54 | -53.04 | 969.96 | 974.07 |
| 91.16772034213463 | -68.56 | -53.17 | 970.4 | 974.52 |
| 91.33506879880998 | -68.55 | -53.33 | 970.8 | 974.93 |
| 91.50241725548533 | -68.98 | -52.97 | 970.61 | 974.75 |
| 91.66976571216065 | -69.31 | -52.81 | 970.37 | 974.52 |
| 91.83711416883601 | -69.24 | -52.52 | 969.32 | 973.45 |
| 92.00446262551137 | -69.17 | -52.15 | 968.02 | 972.13 |
| 92.1718110821867 | -69.19 | -51.71 | 966.47 | 970.55 |
| 92.33915953886203 | -69.34 | -51.26 | 965.1 | 969.18 |
| 92.49721085905541 | -69.56 | -50.79 | 963.83 | 967.91 |
| 92.66455931573077 | -69.77 | -50.33 | 962.56 | 966.63 |
| 92.83190777240611 | -69.87 | -50.03 | 961.18 | 965.25 |
| 92.99925622908145 | -69.92 | -49.61 | 960.26 | 964.3 |
| 93.1666046857568 | -69.83 | -49.21 | 958.45 | 962.47 |
| 93.33395314243214 | -69.73 | -49.19 | 957.09 | 961.11 |
| 93.50130159910749 | -69.99 | -49 | 956.47 | 960.5 |
| 93.66865005578283 | -70.13 | -48.81 | 955.85 | 959.89 |
| 93.83599851245818 | -69.89 | -48.83 | 954.71 | 958.74 |
| 94.00334696913353 | -69.75 | -48.72 | 953.88 | 957.89 |
| 94.17069542580886 | -69.34 | -48.68 | 952.84 | 956.82 |
| 94.3380438824842 | -69.45 | -48.71 | 951.44 | 955.43 |
| 94.50539233915954 | -69.55 | -48.79 | 949.68 | 953.69 |
| 94.66344365935292 | -69.5 | -48.78 | 948.06 | 952.08 |
| 94.83079211602828 | -69.53 | -48.8 | 946.29 | 950.33 |
| 94.99814057270362 | -69.55 | -48.76 | 944.61 | 948.65 |
| 95.16548902937897 | -69.52 | -48.52 | 942.34 | 946.38 |
| 95.33283748605432 | -69.54 | -48.21 | 941 | 945.03 |
| 95.50018594272963 | -69.23 | -48 | 939.55 | 943.55 |
| 95.66753439940499 | -69.13 | -47.92 | 937.07 | 941.07 |
| 95.83488285608034 | -69.14 | -47.84 | 934.64 | 938.64 |
| 96.00223131275567 | -69.05 | -47.58 | 933.39 | 937.37 |
| 96.16957976943102 | -68.92 | -47.55 | 931.85 | 935.83 |
| 96.33692822610638 | -68.7 | -47.29 | 929.83 | 933.79 |
| 96.50427668278171 | -68.68 | -47.07 | 925.59 | 929.56 |
| 96.67162513945706 | -68.42 | -46.79 | 921.82 | 925.76 |
| 96.8389735961324 | -68.54 | -46.35 | 919.17 | 923.11 |
| 96.99702491632577 | -68.61 | -46.02 | 917.27 | 921.2 |
| 97.16437337300111 | -68.42 | -45.99 | 916.26 | 920.19 |
| 97.33172182967647 | -68.46 | -45.97 | 914.16 | 918.09 |
| 97.49907028635181 | -68.3 | -45.63 | 911.05 | 914.96 |
| 97.66641874302715 | -68.14 | -45.25 | 907.59 | 911.5 |
| 97.8337671997025 | -68.1 | -44.89 | 904.37 | 908.27 |
| 98.00111565637785 | -68.15 | -44.55 | 901.36 | 905.26 |
| 98.16846411305319 | -68.04 | -44.28 | 898.42 | 902.32 |
| 98.33581256972855 | -67.9 | -44.03 | 895.5 | 899.39 |
| 98.50316102640389 | -67.83 | -43.92 | 893.85 | 897.74 |
| 98.67050948307921 | -67.83 | -43.86 | 892.08 | 895.97 |
| 98.83785793975456 | -67.92 | -43.82 | 890.23 | 894.14 |
| 99.0052063964299 | -67.81 | -43.75 | 889.18 | 893.09 |
| 99.17255485310525 | -67.65 | -43.75 | 888.23 | 892.13 |
| 99.33060617329863 | -67.73 | -43.64 | 886.22 | 890.13 |
| 99.49795462997399 | -67.7 | -43.41 | 884.33 | 888.23 |
| 99.66530308664933 | -67.62 | -43.36 | 882.2 | 886.12 |
| 99.83265154332467 | -67.87 | -43.28 | 880.86 | 884.8 |
| 100.0 | -68.18 | -43.16 | 879.97 | 883.94 |